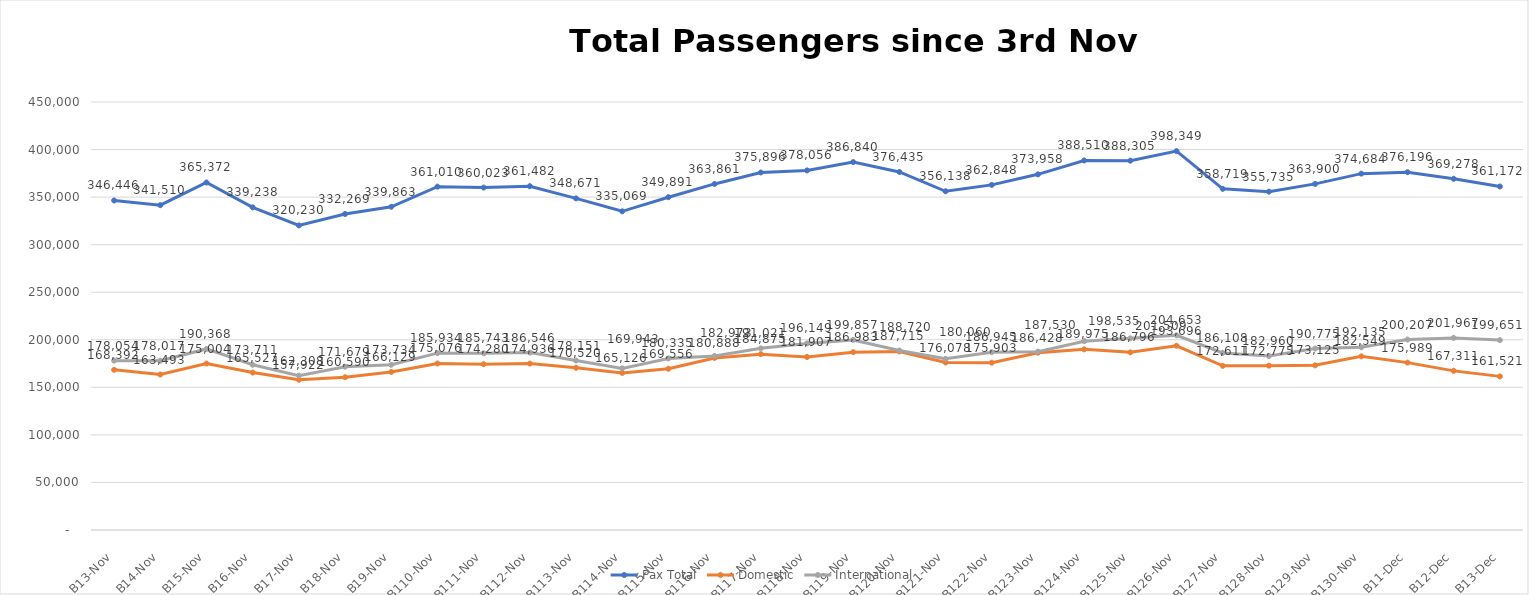
| Category | Pax Total | Domestic | International |
|---|---|---|---|
| 2023-11-03 | 346446 | 168392 | 178054 |
| 2023-11-04 | 341510 | 163493 | 178017 |
| 2023-11-05 | 365372 | 175004 | 190368 |
| 2023-11-06 | 339238 | 165527 | 173711 |
| 2023-11-07 | 320230 | 157922 | 162308 |
| 2023-11-08 | 332269 | 160590 | 171679 |
| 2023-11-09 | 339863 | 166129 | 173734 |
| 2023-11-10 | 361010 | 175076 | 185934 |
| 2023-11-11 | 360023 | 174280 | 185743 |
| 2023-11-12 | 361482 | 174936 | 186546 |
| 2023-11-13 | 348671 | 170520 | 178151 |
| 2023-11-14 | 335069 | 165126 | 169943 |
| 2023-11-15 | 349891 | 169556 | 180335 |
| 2023-11-16 | 363861 | 180888 | 182973 |
| 2023-11-17 | 375896 | 184875 | 191021 |
| 2023-11-18 | 378056 | 181907 | 196149 |
| 2023-11-19 | 386840 | 186983 | 199857 |
| 2023-11-20 | 376435 | 187715 | 188720 |
| 2023-11-21 | 356138 | 176078 | 180060 |
| 2023-11-22 | 362848 | 175903 | 186945 |
| 2023-11-23 | 373958 | 186428 | 187530 |
| 2023-11-24 | 388510 | 189975 | 198535 |
| 2023-11-25 | 388305 | 186796 | 201509 |
| 2023-11-26 | 398349 | 193696 | 204653 |
| 2023-11-27 | 358719 | 172611 | 186108 |
| 2023-11-28 | 355735 | 172775 | 182960 |
| 2023-11-29 | 363900 | 173125 | 190775 |
| 2023-11-30 | 374684 | 182549 | 192135 |
| 2023-12-01 | 376196 | 175989 | 200207 |
| 2023-12-02 | 369278 | 167311 | 201967 |
| 2023-12-03 | 361172 | 161521 | 199651 |